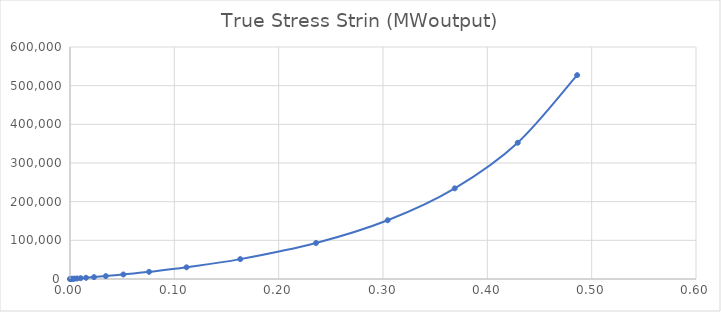
| Category | Series 0 |
|---|---|
| 8.99959502429071e-05 | 18.003 |
| 0.000179983801943807 | 36.012 |
| 0.000314950397916229 | 63.039 |
| 0.000517366143053604 | 103.608 |
| 0.000820912958736214 | 164.527 |
| 0.00127606548202025 | 256.05 |
| 0.00195839109970242 | 393.664 |
| 0.00298102233448872 | 600.824 |
| 0.00451300107383731 | 913.235 |
| 0.00680658256963524 | 1385.63 |
| 0.0102371214079935 | 2102.78 |
| 0.0153610132102306 | 3197.97 |
| 0.0229978113721286 | 4885.29 |
| 0.0343449033807882 | 7518.93 |
| 0.0511277156801529 | 11709.2 |
| 0.0757852575808854 | 18565.4 |
| 0.111667484848671 | 30250.2 |
| 0.163187156184584 | 51381.5 |
| 0.235807819867008 | 93111.6 |
| 0.304488303267768 | 151912 |
| 0.368753404755717 | 234404 |
| 0.429136711841463 | 352433 |
| 0.486080574800857 | 527190 |